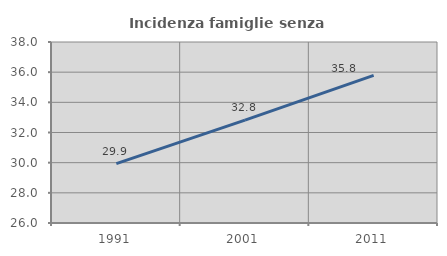
| Category | Incidenza famiglie senza nuclei |
|---|---|
| 1991.0 | 29.934 |
| 2001.0 | 32.825 |
| 2011.0 | 35.792 |